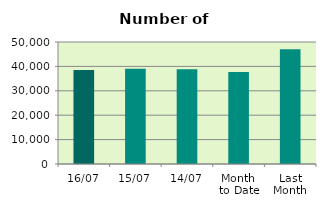
| Category | Series 0 |
|---|---|
| 16/07 | 38556 |
| 15/07 | 39052 |
| 14/07 | 38828 |
| Month 
to Date | 37667.667 |
| Last
Month | 46980.273 |